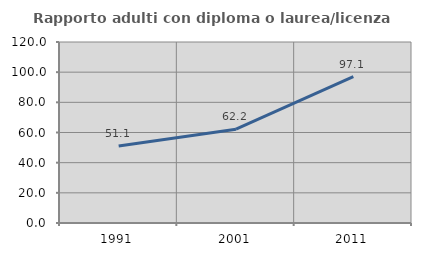
| Category | Rapporto adulti con diploma o laurea/licenza media  |
|---|---|
| 1991.0 | 51.064 |
| 2001.0 | 62.162 |
| 2011.0 | 97.059 |